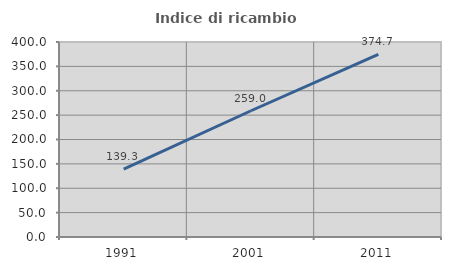
| Category | Indice di ricambio occupazionale  |
|---|---|
| 1991.0 | 139.262 |
| 2001.0 | 258.979 |
| 2011.0 | 374.708 |